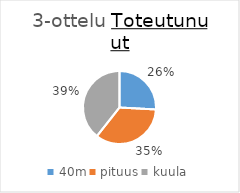
| Category | Series 0 |
|---|---|
| 40m | 203 |
| pituus | 273 |
| kuula | 309 |